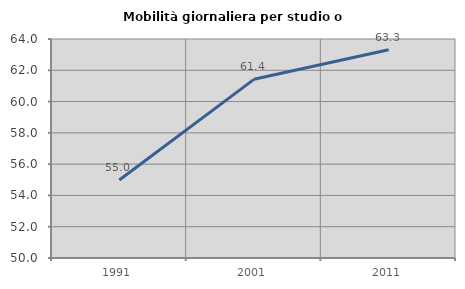
| Category | Mobilità giornaliera per studio o lavoro |
|---|---|
| 1991.0 | 54.983 |
| 2001.0 | 61.422 |
| 2011.0 | 63.31 |